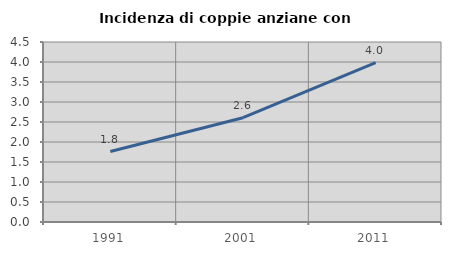
| Category | Incidenza di coppie anziane con figli |
|---|---|
| 1991.0 | 1.761 |
| 2001.0 | 2.607 |
| 2011.0 | 3.986 |